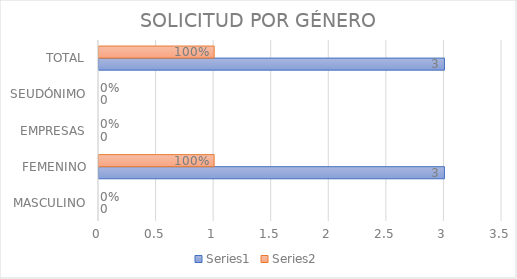
| Category | Series 0 | Series 1 |
|---|---|---|
| MASCULINO | 0 | 0 |
| FEMENINO | 3 | 1 |
| EMPRESAS | 0 | 0 |
| SEUDÓNIMO | 0 | 0 |
| TOTAL | 3 | 1 |